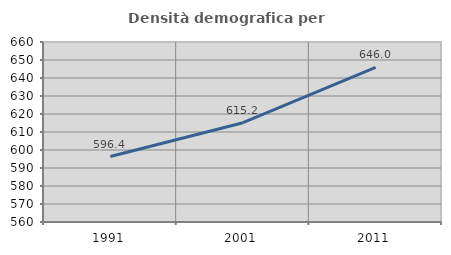
| Category | Densità demografica |
|---|---|
| 1991.0 | 596.366 |
| 2001.0 | 615.16 |
| 2011.0 | 645.962 |